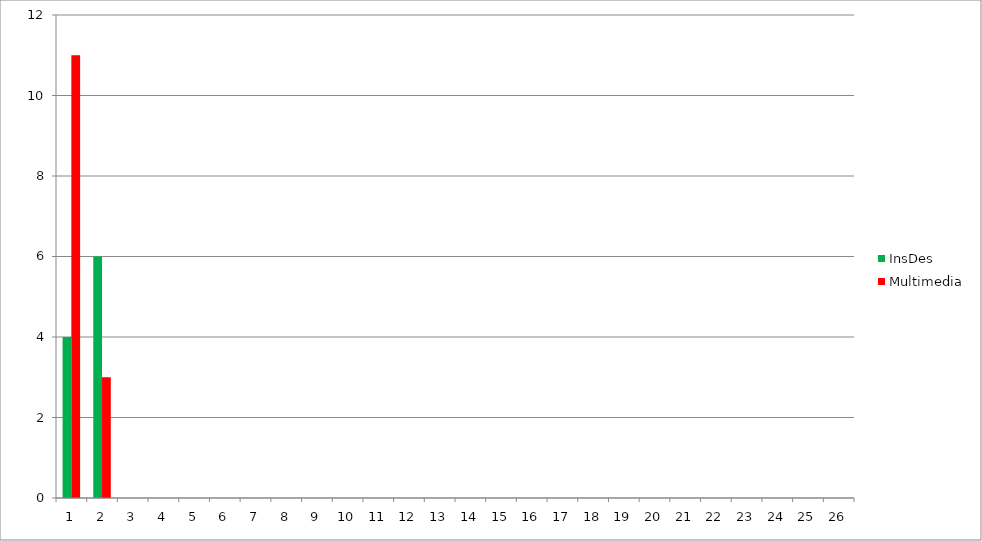
| Category | InsDes | Multimedia |
|---|---|---|
| 0 | 4 | 11 |
| 1 | 6 | 3 |
| 2 | 0 | 0 |
| 3 | 0 | 0 |
| 4 | 0 | 0 |
| 5 | 0 | 0 |
| 6 | 0 | 0 |
| 7 | 0 | 0 |
| 8 | 0 | 0 |
| 9 | 0 | 0 |
| 10 | 0 | 0 |
| 11 | 0 | 0 |
| 12 | 0 | 0 |
| 13 | 0 | 0 |
| 14 | 0 | 0 |
| 15 | 0 | 0 |
| 16 | 0 | 0 |
| 17 | 0 | 0 |
| 18 | 0 | 0 |
| 19 | 0 | 0 |
| 20 | 0 | 0 |
| 21 | 0 | 0 |
| 22 | 0 | 0 |
| 23 | 0 | 0 |
| 24 | 0 | 0 |
| 25 | 0 | 0 |